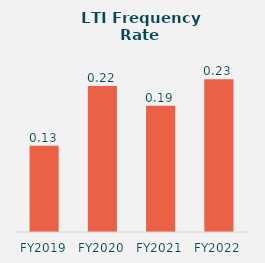
| Category | Series 0 |
|---|---|
| FY2019 | 0.13 |
| FY2020 | 0.22 |
| FY2021 | 0.19 |
| FY2022 | 0.23 |